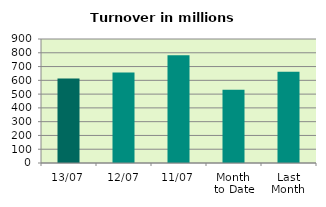
| Category | Series 0 |
|---|---|
| 13/07 | 612.533 |
| 12/07 | 656.949 |
| 11/07 | 781.648 |
| Month 
to Date | 531.451 |
| Last
Month | 663.186 |